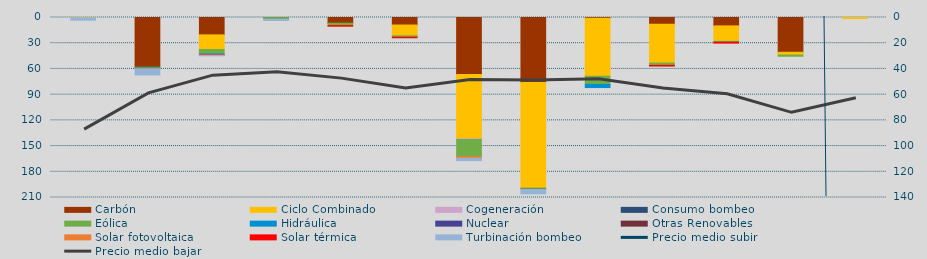
| Category | Carbón | Ciclo Combinado | Cogeneración | Consumo bombeo | Eólica | Hidráulica | Nuclear | Otras Renovables | Solar fotovoltaica | Solar térmica | Turbinación bombeo |
|---|---|---|---|---|---|---|---|---|---|---|---|
| 0 | 0 | 400 | 0 |  | 0 | 0 |  | 0 | 0 | 0 | 2763.2 |
| 1 | 58033.7 | 0 | 0 |  | 988.1 | 1026.5 |  | 0 | 57.8 | 0 | 6933.6 |
| 2 | 20255.7 | 17094 | 0 |  | 5344.3 | 623 |  | 0 | 0 | 617.6 | 755.1 |
| 3 | 158.4 | 0 | 0 |  | 1844.3 | 12 |  | 0 | 0 | 0 | 1460 |
| 4 | 6575 | 0 | 0 |  | 2859 | 0 |  | 0 | 0 | 725.3 | 0 |
| 5 | 8771 | 12552 | 0 |  | 1652.9 | 70 |  | 0 | 0 | 608.7 | 0 |
| 6 | 66423 | 75034.9 | 910.1 |  | 19943.3 | 36 |  | 0 | 1820.4 | 0 | 2822.9 |
| 7 | 75870.4 | 123130.8 | 0 |  | 1278.3 | 0 |  | 288.4 | 0 | 0 | 5090.1 |
| 8 | 802.5 | 67762.6 | 0 |  | 9561.7 | 4762.5 |  | 0 | 0 | 0 | 0 |
| 9 | 7913 | 45184 | 0 |  | 2732.2 | 54.3 |  | 0 | 0 | 784 | 0 |
| 10 | 9798 | 18106.5 | 0 |  | 568.3 | 428.4 |  | 0 | 0 | 944 | 0 |
| 11 | 40570 | 3247 | 0 |  | 1377.6 | 0 |  | 0 | 0 | 0 | 0 |
| 12 | 0 | 1230 | 0 |  | 0 | 0 |  | 0 | 0 | 0 | 0 |